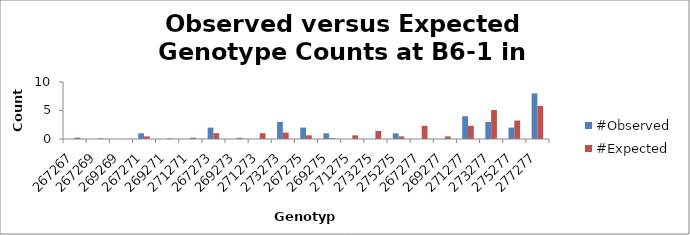
| Category | #Observed | #Expected |
|---|---|---|
| 267267.0 | 0 | 0.231 |
| 267269.0 | 0 | 0.093 |
| 269269.0 | 0 | 0.009 |
| 267271.0 | 1 | 0.463 |
| 269271.0 | 0 | 0.093 |
| 271271.0 | 0 | 0.231 |
| 267273.0 | 2 | 1.019 |
| 269273.0 | 0 | 0.204 |
| 271273.0 | 0 | 1.019 |
| 273273.0 | 3 | 1.12 |
| 267275.0 | 2 | 0.648 |
| 269275.0 | 1 | 0.13 |
| 271275.0 | 0 | 0.648 |
| 273275.0 | 0 | 1.426 |
| 275275.0 | 1 | 0.454 |
| 267277.0 | 0 | 2.315 |
| 269277.0 | 0 | 0.463 |
| 271277.0 | 4 | 2.315 |
| 273277.0 | 3 | 5.093 |
| 275277.0 | 2 | 3.241 |
| 277277.0 | 8 | 5.787 |